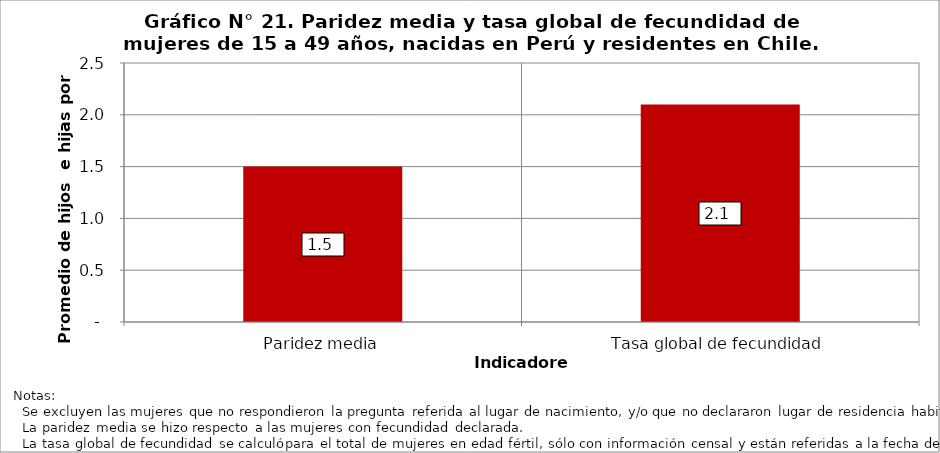
| Category | Perú |
|---|---|
| Paridez media | 1.5 |
| Tasa global de fecundidad | 2.1 |